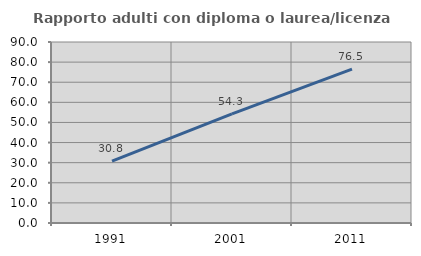
| Category | Rapporto adulti con diploma o laurea/licenza media  |
|---|---|
| 1991.0 | 30.769 |
| 2001.0 | 54.286 |
| 2011.0 | 76.471 |